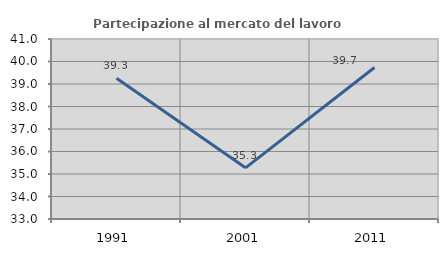
| Category | Partecipazione al mercato del lavoro  femminile |
|---|---|
| 1991.0 | 39.255 |
| 2001.0 | 35.275 |
| 2011.0 | 39.735 |